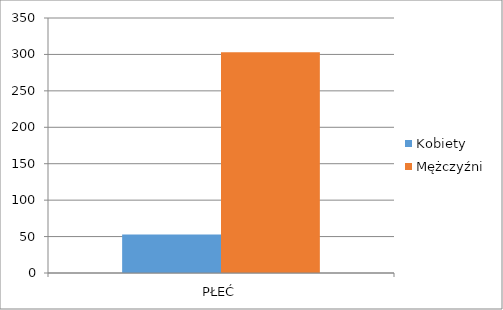
| Category | Kobiety | Mężczyźni |
|---|---|---|
| PŁEĆ | 53 | 303 |